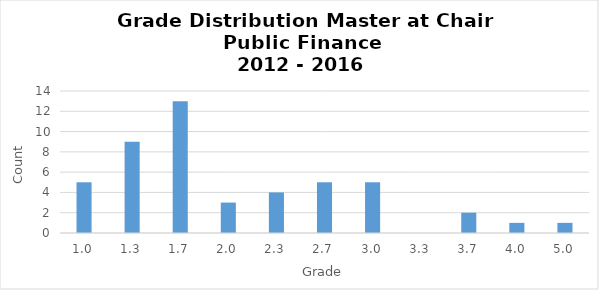
| Category | Häufigkeit |
|---|---|
| 1.0 | 5 |
| 1.3 | 9 |
| 1.7 | 13 |
| 2.0 | 3 |
| 2.3 | 4 |
| 2.7 | 5 |
| 3.0 | 5 |
| 3.3 | 0 |
| 3.7 | 2 |
| 4.0 | 1 |
| 5.0 | 1 |